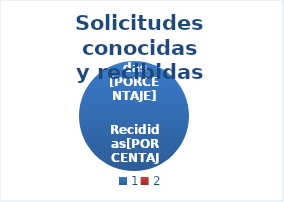
| Category | Series 0 |
|---|---|
| 0 | 14 |
| 1 | 0 |